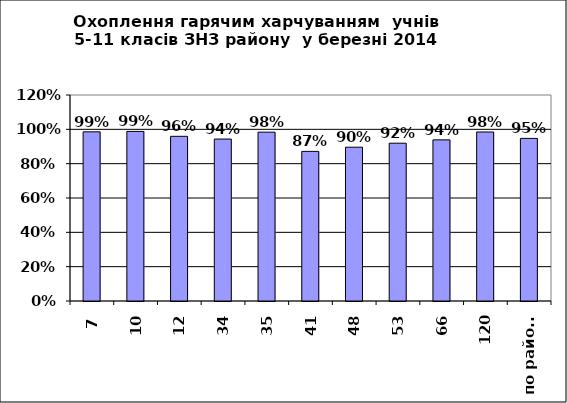
| Category | 135 326 471 350 |
|---|---|
| 7 | 0.985 |
| 10 | 0.988 |
| 12 | 0.959 |
| 34 | 0.943 |
| 35 | 0.984 |
| 41 | 0.872 |
| 48 | 0.896 |
| 53 | 0.919 |
| 66 | 0.939 |
| 120 | 0.984 |
| по району | 0.947 |